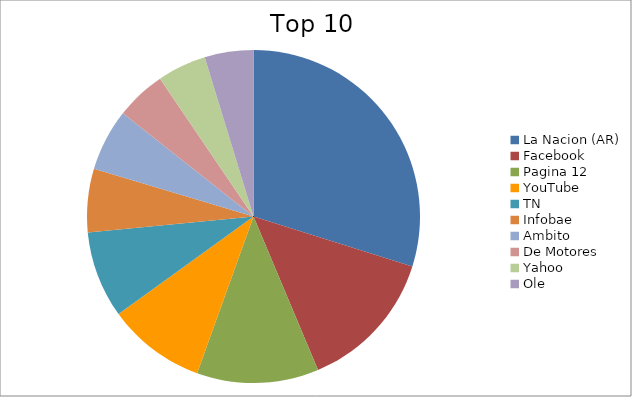
| Category | Series 0 |
|---|---|
| La Nacion (AR) | 15.01 |
| Facebook | 6.95 |
| Pagina 12 | 5.95 |
| YouTube | 4.8 |
| TN | 4.24 |
| Infobae | 3.09 |
| Ambito | 3.03 |
| De Motores | 2.45 |
| Yahoo | 2.39 |
| Ole | 2.38 |